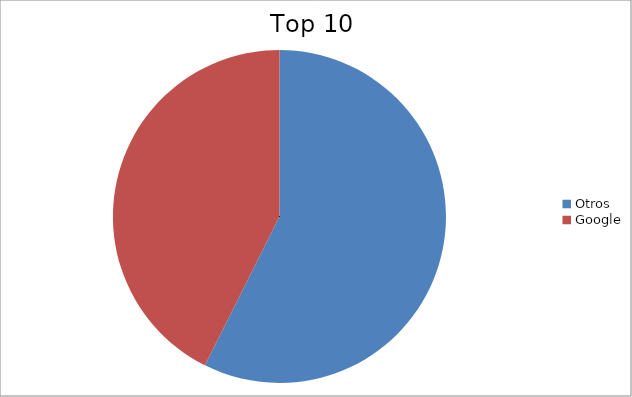
| Category | Series 0 |
|---|---|
| Otros | 57.39 |
| Google | 42.61 |